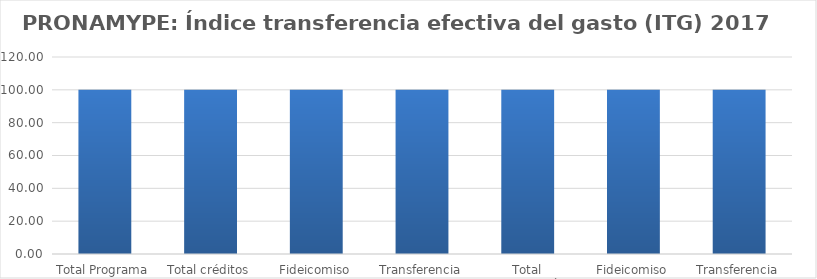
| Category | Índice transferencia efectiva del gasto (ITG) |
|---|---|
| Total Programa | 100 |
| Total créditos | 100 |
| Fideicomiso | 100 |
| Transferencia | 100 |
| Total capacitación | 100 |
| Fideicomiso | 100 |
| Transferencia | 100 |